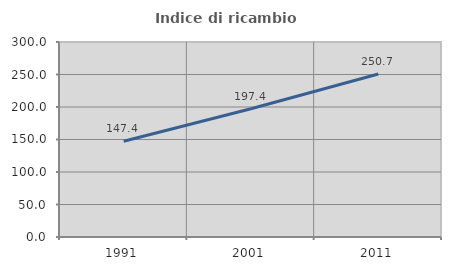
| Category | Indice di ricambio occupazionale  |
|---|---|
| 1991.0 | 147.368 |
| 2001.0 | 197.403 |
| 2011.0 | 250.725 |